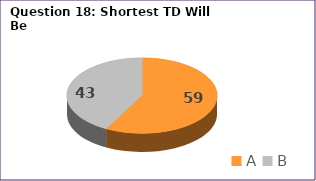
| Category | Series 0 |
|---|---|
| A | 59 |
| B | 43 |